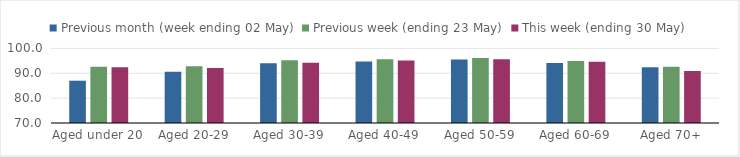
| Category | Previous month (week ending 02 May) | Previous week (ending 23 May) | This week (ending 30 May) |
|---|---|---|---|
| Aged under 20 | 87.018 | 92.609 | 92.391 |
| Aged 20-29 | 90.579 | 92.881 | 92.098 |
| Aged 30-39 | 94.078 | 95.249 | 94.215 |
| Aged 40-49 | 94.739 | 95.669 | 95.176 |
| Aged 50-59 | 95.578 | 96.142 | 95.655 |
| Aged 60-69 | 94.172 | 94.9 | 94.607 |
| Aged 70+ | 92.468 | 92.663 | 90.87 |